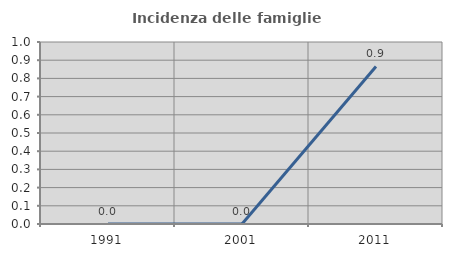
| Category | Incidenza delle famiglie numerose |
|---|---|
| 1991.0 | 0 |
| 2001.0 | 0 |
| 2011.0 | 0.866 |